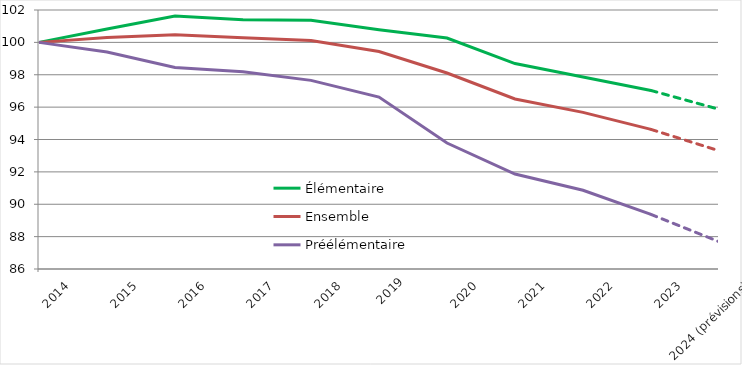
| Category | Élémentaire | Ensemble | Préélémentaire |
|---|---|---|---|
| 2014 | 100 | 100 | 100 |
| 2015 | 100.823 | 100.304 | 99.408 |
| 2016 | 101.622 | 100.477 | 98.455 |
| 2017 | 101.405 | 100.293 | 98.189 |
| 2018 | 101.365 | 100.119 | 97.653 |
| 2019
 | 100.777 | 99.435 | 96.621 |
| 2020 | 100.269 | 98.107 | 93.782 |
| 2021 | 98.69 | 96.502 | 91.865 |
| 2022 | 97.861 | 95.674 | 90.865 |
| 2023 | 97.028 | 94.624 | 89.372 |
| 2024 (prévisions) | 95.868 | 93.306 | 87.689 |